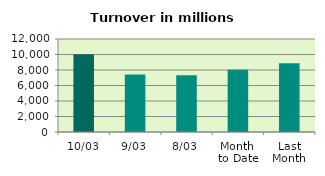
| Category | Series 0 |
|---|---|
| 10/03 | 10036.067 |
| 9/03 | 7409.56 |
| 8/03 | 7313.478 |
| Month 
to Date | 8044.476 |
| Last
Month | 8884.685 |